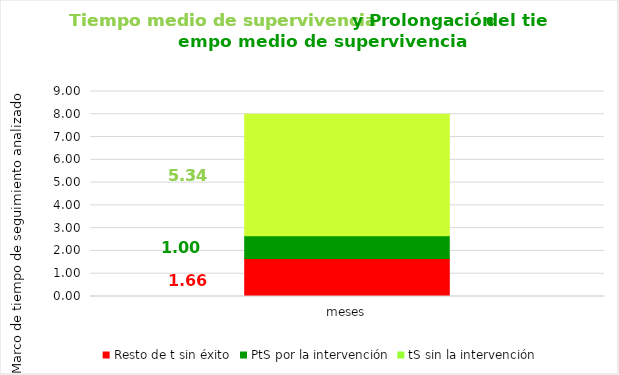
| Category | Resto de t sin éxito | PtS por la intervención | tS sin la intervención |
|---|---|---|---|
| meses | 1.665 | 0.999 | 5.337 |